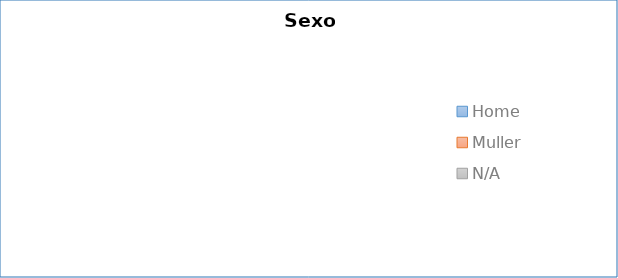
| Category | 1. Sexo |
|---|---|
| Home | 0 |
| Muller | 0 |
| N/A | 0 |